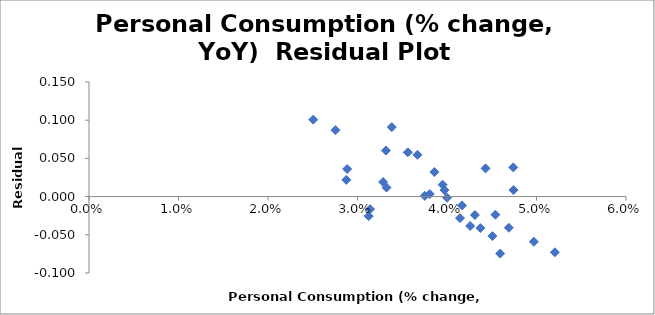
| Category | Series 0 |
|---|---|
| 0.038072990307575605 | 0.003 |
| 0.032863754876003126 | 0.019 |
| 0.039509495736710365 | 0.016 |
| 0.04431054230367004 | 0.037 |
| 0.04740519947097277 | 0.038 |
| 0.04743361446490413 | 0.009 |
| 0.03971788802473308 | 0.009 |
| 0.04167699849314288 | -0.012 |
| 0.03324506930767712 | 0.012 |
| 0.028845255665365332 | 0.036 |
| 0.03383325899494505 | 0.091 |
| 0.02753973485680805 | 0.087 |
| 0.025052668058988203 | 0.101 |
| 0.02875379056127536 | 0.022 |
| 0.03140476554284222 | -0.016 |
| 0.031247772471309387 | -0.026 |
| 0.04594469554076652 | -0.075 |
| 0.052052352416842584 | -0.073 |
| 0.049707627820236855 | -0.059 |
| 0.04507555793639151 | -0.052 |
| 0.04259101735284121 | -0.038 |
| 0.038588337933175065 | 0.032 |
| 0.0331742144369267 | 0.06 |
| 0.035624524620523124 | 0.058 |
| 0.03669829562606575 | 0.055 |
| 0.037518072483785136 | 0.001 |
| 0.04373608890245961 | -0.041 |
| 0.0469085538658045 | -0.041 |
| 0.04145122575060012 | -0.028 |
| 0.04000716220845146 | -0.001 |
| 0.04540625433045409 | -0.024 |
| 0.04312152568609351 | -0.024 |